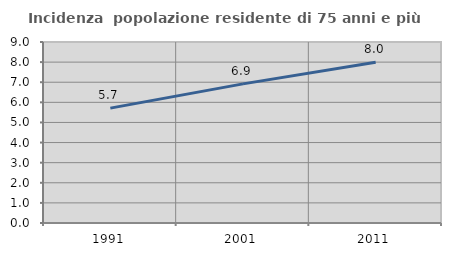
| Category | Incidenza  popolazione residente di 75 anni e più |
|---|---|
| 1991.0 | 5.713 |
| 2001.0 | 6.918 |
| 2011.0 | 7.997 |